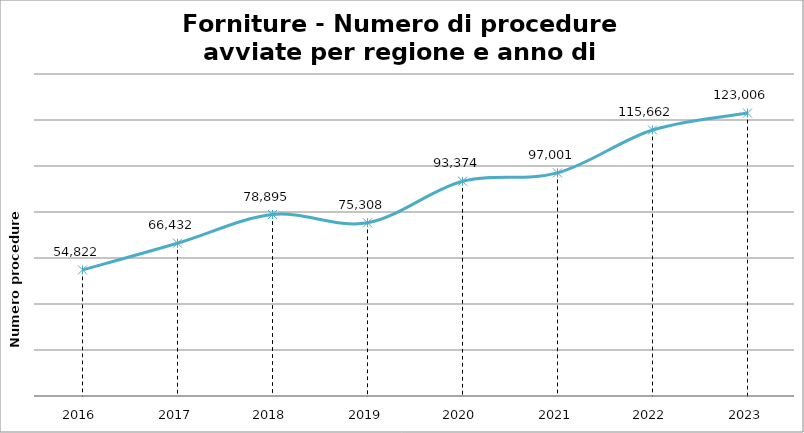
| Category | Totale |
|---|---|
| 2016.0 | 54822 |
| 2017.0 | 66432 |
| 2018.0 | 78895 |
| 2019.0 | 75308 |
| 2020.0 | 93374 |
| 2021.0 | 97001 |
| 2022.0 | 115662 |
| 2023.0 | 123006 |